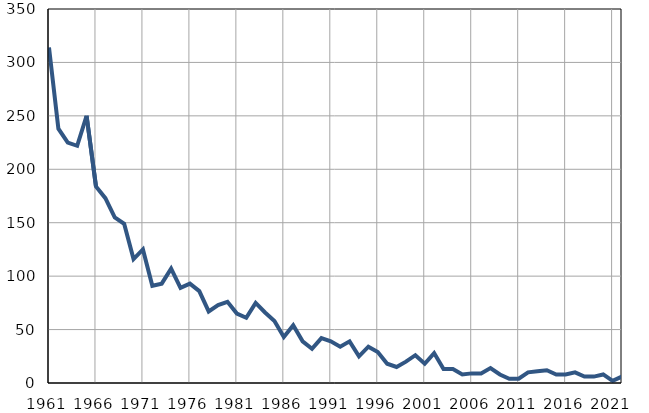
| Category | Умрла 
одојчад |
|---|---|
| 1961.0 | 314 |
| 1962.0 | 238 |
| 1963.0 | 225 |
| 1964.0 | 222 |
| 1965.0 | 250 |
| 1966.0 | 184 |
| 1967.0 | 173 |
| 1968.0 | 155 |
| 1969.0 | 149 |
| 1970.0 | 116 |
| 1971.0 | 125 |
| 1972.0 | 91 |
| 1973.0 | 93 |
| 1974.0 | 107 |
| 1975.0 | 89 |
| 1976.0 | 93 |
| 1977.0 | 86 |
| 1978.0 | 67 |
| 1979.0 | 73 |
| 1980.0 | 76 |
| 1981.0 | 65 |
| 1982.0 | 61 |
| 1983.0 | 75 |
| 1984.0 | 66 |
| 1985.0 | 58 |
| 1986.0 | 43 |
| 1987.0 | 54 |
| 1988.0 | 39 |
| 1989.0 | 32 |
| 1990.0 | 42 |
| 1991.0 | 39 |
| 1992.0 | 34 |
| 1993.0 | 39 |
| 1994.0 | 25 |
| 1995.0 | 34 |
| 1996.0 | 29 |
| 1997.0 | 18 |
| 1998.0 | 15 |
| 1999.0 | 20 |
| 2000.0 | 26 |
| 2001.0 | 18 |
| 2002.0 | 28 |
| 2003.0 | 13 |
| 2004.0 | 13 |
| 2005.0 | 8 |
| 2006.0 | 9 |
| 2007.0 | 9 |
| 2008.0 | 14 |
| 2009.0 | 8 |
| 2010.0 | 4 |
| 2011.0 | 4 |
| 2012.0 | 10 |
| 2013.0 | 11 |
| 2014.0 | 12 |
| 2015.0 | 8 |
| 2016.0 | 8 |
| 2017.0 | 10 |
| 2018.0 | 6 |
| 2019.0 | 6 |
| 2020.0 | 8 |
| 2021.0 | 2 |
| 2022.0 | 6 |